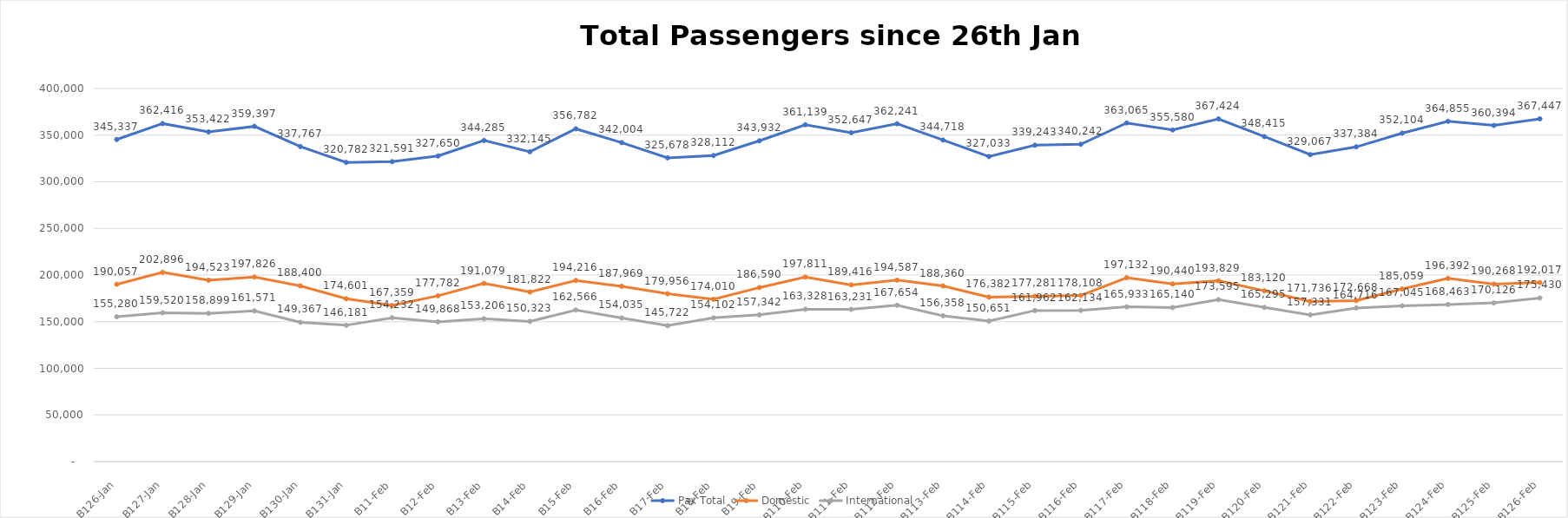
| Category | Pax Total |  Domestic  |  International  |
|---|---|---|---|
| 2023-01-26 | 345337 | 190057 | 155280 |
| 2023-01-27 | 362416 | 202896 | 159520 |
| 2023-01-28 | 353422 | 194523 | 158899 |
| 2023-01-29 | 359397 | 197826 | 161571 |
| 2023-01-30 | 337767 | 188400 | 149367 |
| 2023-01-31 | 320782 | 174601 | 146181 |
| 2023-02-01 | 321591 | 167359 | 154232 |
| 2023-02-02 | 327650 | 177782 | 149868 |
| 2023-02-03 | 344285 | 191079 | 153206 |
| 2023-02-04 | 332145 | 181822 | 150323 |
| 2023-02-05 | 356782 | 194216 | 162566 |
| 2023-02-06 | 342004 | 187969 | 154035 |
| 2023-02-07 | 325678 | 179956 | 145722 |
| 2023-02-08 | 328112 | 174010 | 154102 |
| 2023-02-09 | 343932 | 186590 | 157342 |
| 2023-02-10 | 361139 | 197811 | 163328 |
| 2023-02-11 | 352647 | 189416 | 163231 |
| 2023-02-12 | 362241 | 194587 | 167654 |
| 2023-02-13 | 344718 | 188360 | 156358 |
| 2023-02-14 | 327033 | 176382 | 150651 |
| 2023-02-15 | 339243 | 177281 | 161962 |
| 2023-02-16 | 340242 | 178108 | 162134 |
| 2023-02-17 | 363065 | 197132 | 165933 |
| 2023-02-18 | 355580 | 190440 | 165140 |
| 2023-02-19 | 367424 | 193829 | 173595 |
| 2023-02-20 | 348415 | 183120 | 165295 |
| 2023-02-21 | 329067 | 171736 | 157331 |
| 2023-02-22 | 337384 | 172668 | 164716 |
| 2023-02-23 | 352104 | 185059 | 167045 |
| 2023-02-24 | 364855 | 196392 | 168463 |
| 2023-02-25 | 360394 | 190268 | 170126 |
| 2023-02-26 | 367447 | 192017 | 175430 |